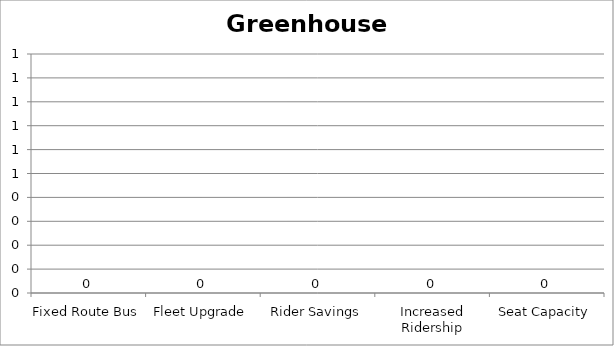
| Category | Greenhouse Gas |
|---|---|
| Fixed Route Bus | 0 |
| Fleet Upgrade | 0 |
| Rider Savings | 0 |
| Increased Ridership | 0 |
| Seat Capacity | 0 |